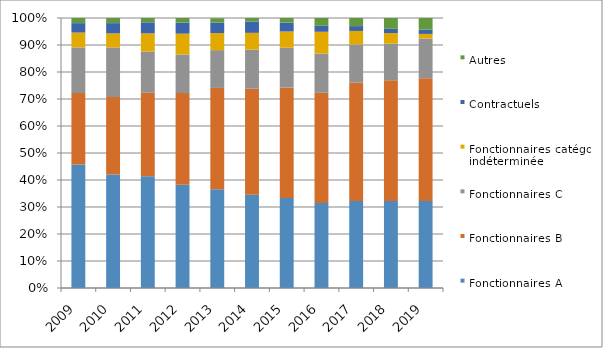
| Category | Fonctionnaires A | Fonctionnaires B | Fonctionnaires C | Fonctionnaires catégorie indéterminée | Contractuels | Autres |
|---|---|---|---|---|---|---|
| 2009.0 | 0.457 | 0.265 | 0.169 | 0.055 | 0.035 | 0.019 |
| 2010.0 | 0.42 | 0.287 | 0.184 | 0.052 | 0.038 | 0.019 |
| 2011.0 | 0.414 | 0.309 | 0.153 | 0.067 | 0.041 | 0.016 |
| 2012.0 | 0.382 | 0.34 | 0.143 | 0.077 | 0.041 | 0.017 |
| 2013.0 | 0.366 | 0.375 | 0.14 | 0.063 | 0.039 | 0.016 |
| 2014.0 | 0.345 | 0.393 | 0.145 | 0.062 | 0.042 | 0.014 |
| 2015.0 | 0.333 | 0.409 | 0.148 | 0.06 | 0.033 | 0.017 |
| 2016.0 | 0.315 | 0.408 | 0.145 | 0.081 | 0.022 | 0.029 |
| 2017.0 | 0.322 | 0.439 | 0.141 | 0.05 | 0.018 | 0.03 |
| 2018.0 | 0.322 | 0.447 | 0.136 | 0.039 | 0.016 | 0.04 |
| 2019.0 | 0.322 | 0.455 | 0.147 | 0.017 | 0.016 | 0.044 |